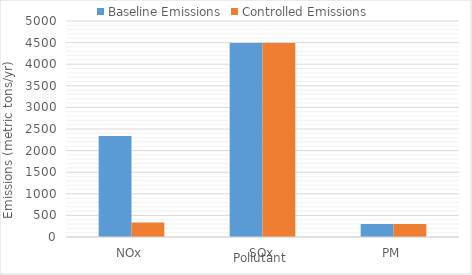
| Category | Baseline Emissions | Controlled Emissions |
|---|---|---|
| NOx | 2339.742 | 335.964 |
| SOx | 4491.189 | 4491.189 |
| PM | 298.755 | 298.755 |